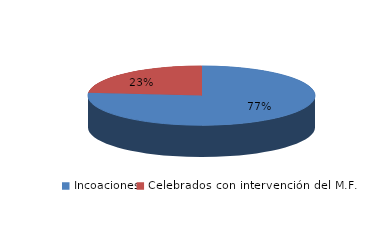
| Category | Series 0 |
|---|---|
| Incoaciones | 2138 |
| Celebrados con intervención del M.F. | 654 |